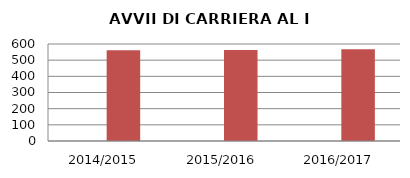
| Category | ANNO | NUMERO |
|---|---|---|
| 2014/2015 | 0 | 561 |
| 2015/2016 | 0 | 563 |
| 2016/2017 | 0 | 567 |